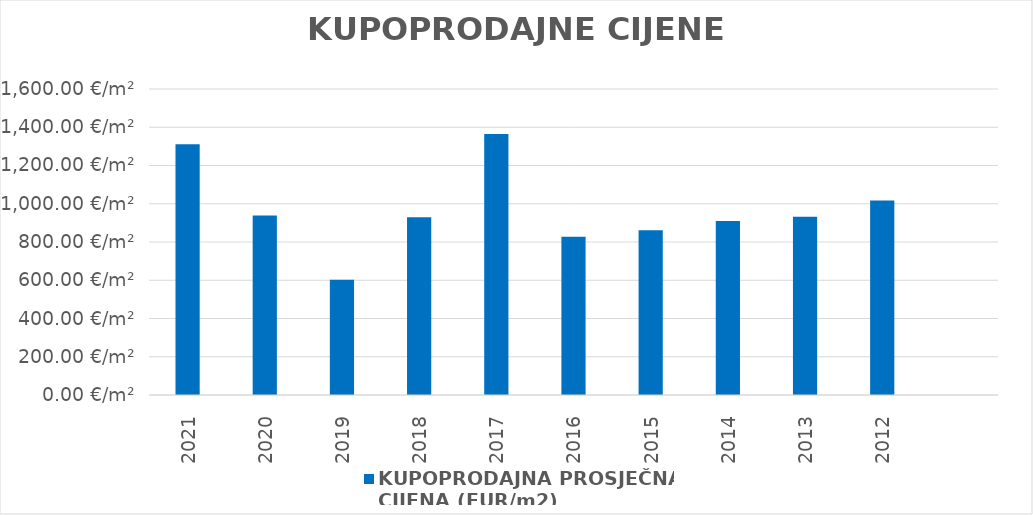
| Category | KUPOPRODAJNA PROSJEČNA 
CIJENA (EUR/m2) |
|---|---|
| 2021 | 1903-08-02 22:51:04 |
| 2020 | 1902-07-26 14:46:47 |
| 2019 | 1901-08-24 09:32:28 |
| 2018 | 1902-07-17 21:59:52 |
| 2017 | 1903-09-25 20:02:50 |
| 2016 | 1902-04-06 04:22:34 |
| 2015 | 1902-05-10 20:15:14 |
| 2014 | 1902-06-28 01:31:27 |
| 2013 | 1902-07-20 09:29:50 |
| 2012 | 1902-10-12 18:07:26 |